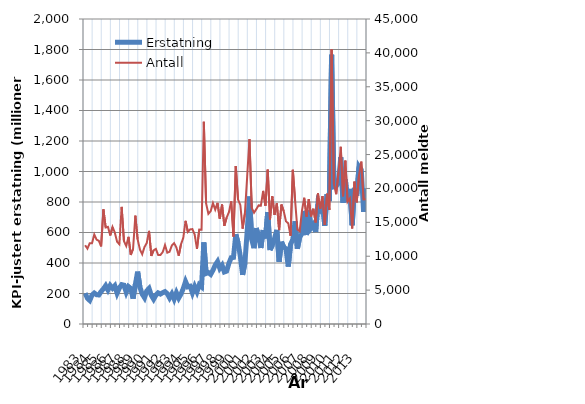
| Category | Erstatning |
|---|---|
| 1983.0 | 201.799 |
| nan | 169.038 |
| nan | 154.585 |
| nan | 189.36 |
| 1984.0 | 203.057 |
| nan | 192.077 |
| nan | 190.441 |
| nan | 213.009 |
| 1985.0 | 230.184 |
| nan | 251.598 |
| nan | 222.945 |
| nan | 252.85 |
| 1986.0 | 234.431 |
| nan | 250.851 |
| nan | 201.901 |
| nan | 236.27 |
| 1987.0 | 258.121 |
| nan | 254.718 |
| nan | 208.446 |
| nan | 245.243 |
| 1988.0 | 233.422 |
| nan | 166.394 |
| nan | 259.163 |
| nan | 343.318 |
| 1989.0 | 242.547 |
| nan | 196.036 |
| nan | 172.495 |
| nan | 217.622 |
| 1990.0 | 233.016 |
| nan | 187.462 |
| nan | 162.579 |
| nan | 189.236 |
| 1991.0 | 204.204 |
| nan | 196.341 |
| nan | 205.484 |
| nan | 212.445 |
| 1992.0 | 198.463 |
| nan | 171.007 |
| nan | 197.593 |
| nan | 163.054 |
| 1993.0 | 204.588 |
| nan | 170.263 |
| nan | 196.708 |
| nan | 232.712 |
| 1994.0 | 278.723 |
| nan | 243.667 |
| nan | 247.563 |
| nan | 204.054 |
| 1995.0 | 245.842 |
| nan | 211.497 |
| nan | 256.991 |
| nan | 244 |
| 1996.0 | 535.09 |
| nan | 331.337 |
| nan | 337.257 |
| nan | 325.257 |
| 1997.0 | 352.12 |
| nan | 386.392 |
| nan | 409.193 |
| nan | 365.095 |
| 1998.0 | 385.166 |
| nan | 341.221 |
| nan | 346.795 |
| nan | 398.602 |
| 1999.0 | 434.76 |
| nan | 436.872 |
| nan | 587.867 |
| nan | 532.391 |
| 2000.0 | 443.784 |
| nan | 322.284 |
| nan | 399.541 |
| nan | 609.178 |
| 2001.0 | 836.026 |
| nan | 553.453 |
| nan | 497.074 |
| nan | 628.9 |
| 2002.0 | 572.775 |
| nan | 498.37 |
| nan | 615.9 |
| nan | 561.222 |
| 2003.0 | 734.001 |
| nan | 485.295 |
| nan | 516.292 |
| nan | 562.424 |
| 2004.0 | 617.01 |
| nan | 407.925 |
| nan | 539.294 |
| nan | 504.074 |
| 2005.0 | 493.365 |
| nan | 376.506 |
| nan | 522.692 |
| nan | 553.922 |
| 2006.0 | 673.302 |
| nan | 493.774 |
| nan | 568.148 |
| nan | 592.735 |
| 2007.0 | 741.926 |
| nan | 583.311 |
| nan | 745.277 |
| nan | 630.118 |
| 2008.0 | 651.624 |
| nan | 603.24 |
| nan | 787.866 |
| nan | 756.664 |
| 2009.0 | 794.035 |
| nan | 644.63 |
| nan | 851.539 |
| nan | 804.882 |
| 2010.0 | 1765.585 |
| nan | 900.536 |
| nan | 904.868 |
| nan | 925.719 |
| 2011.0 | 1094.03 |
| nan | 795.553 |
| nan | 948.575 |
| nan | 799.425 |
| 2012.0 | 885.653 |
| nan | 647.494 |
| nan | 892.713 |
| nan | 840.573 |
| 2013.0 | 1032.312 |
| nan | 1010.828 |
| nan | 735.525 |
| nan | 888.429 |